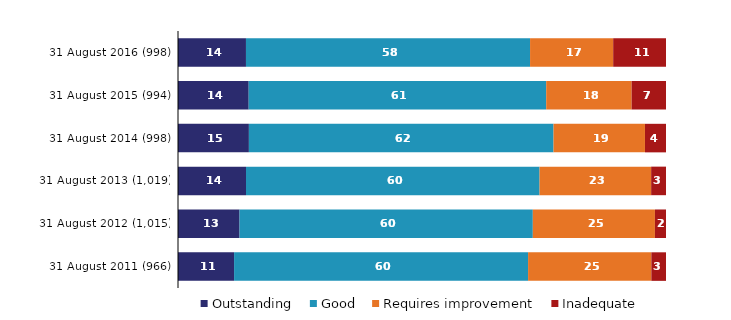
| Category | Outstanding | Good | Requires improvement | Inadequate |
|---|---|---|---|---|
| 31 August 2016 (998) | 13.928 | 58.216 | 17.034 | 10.822 |
| 31 August 2015 (994) | 14.487 | 60.966 | 17.505 | 7.042 |
| 31 August 2014 (998) | 14.529 | 62.425 | 18.737 | 4.309 |
| 31 August 2013 (1,019) | 13.935 | 60.157 | 22.866 | 3.042 |
| 31 August 2012 (1,015) | 12.611 | 60.099 | 25.025 | 2.266 |
| 31 August 2011 (966) | 11.491 | 60.248 | 25.259 | 3.002 |